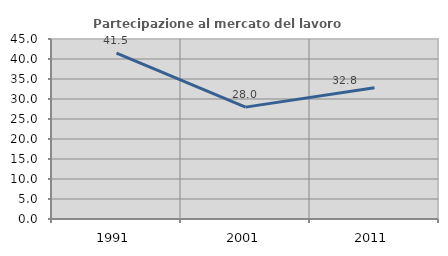
| Category | Partecipazione al mercato del lavoro  femminile |
|---|---|
| 1991.0 | 41.458 |
| 2001.0 | 27.968 |
| 2011.0 | 32.816 |